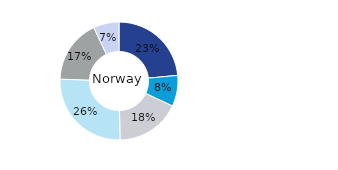
| Category | Norway |
|---|---|
| Office | 0.235 |
| Residential | 0.085 |
| Retail | 0.178 |
| Logistics* | 0.258 |
| Public Sector | 0.175 |
| Other | 0.07 |